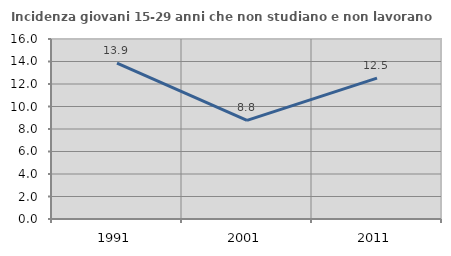
| Category | Incidenza giovani 15-29 anni che non studiano e non lavorano  |
|---|---|
| 1991.0 | 13.865 |
| 2001.0 | 8.765 |
| 2011.0 | 12.526 |